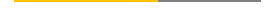
| Category | Red | Orange | Yellow | Green | None |
|---|---|---|---|---|---|
| 0 | 0 | 0 | 0.583 | 0 | 0.417 |